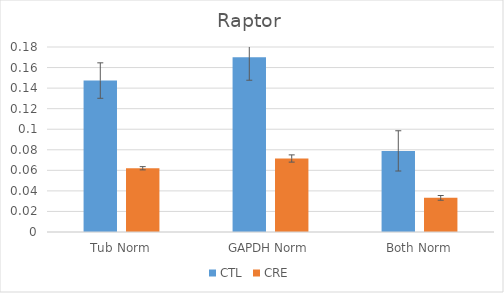
| Category | CTL | CRE |
|---|---|---|
| Tub Norm | 0.147 | 0.062 |
| GAPDH Norm | 0.17 | 0.072 |
| Both Norm | 0.079 | 0.033 |